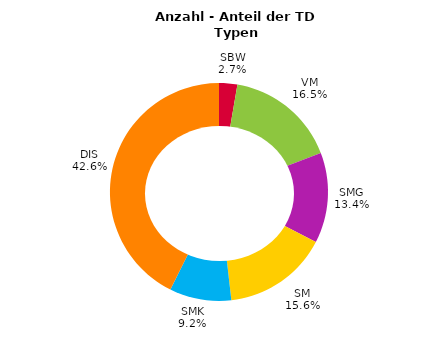
| Category | Series 0 |
|---|---|
| SBW | 0.027 |
| VM | 0.165 |
| SMG | 0.134 |
| SM | 0.156 |
| SMK | 0.092 |
| DIS | 0.426 |